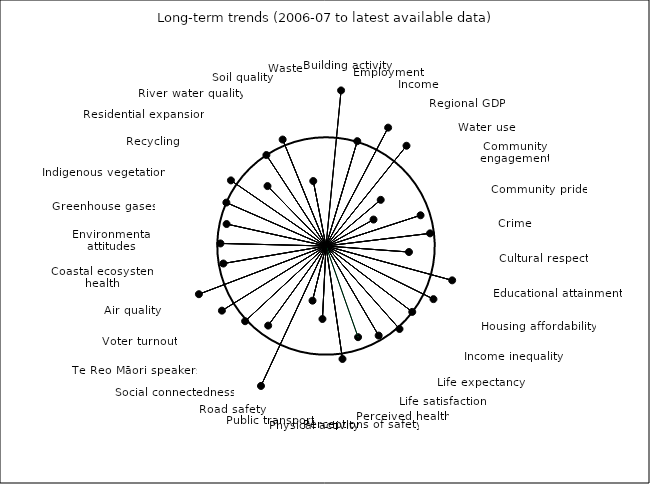
| Category | 2007 | latest |
|---|---|---|
|  | 1 | 0 |
| Building activity | 1 | 1.437 |
|  | 1 | 0 |
| Employment | 1 | 1.006 |
|  | 1 | 0 |
| Income | 1 | 1.229 |
|  | 1 | 0 |
| Regional GDP | 1 | 1.182 |
|  | 1 | 0 |
| Water use | 1 | 0.658 |
|  | 1 | 0 |
| Community engagement | 1 | 0.5 |
|  | 1 | 0 |
| Community pride | 1 | 0.914 |
|  | 1 | 0 |
| Crime | 1 | 0.964 |
|  | 1 | 0 |
| Cultural respect | 1 | 0.765 |
|  | 1 | 0 |
| Educational attainment | 1 | 1.202 |
|  | 1 | 0 |
| Housing affordability | 1 | 1.102 |
|  | 1 | 0 |
| Income inequality | 1 | 0.998 |
|  | 1 | 0 |
| Life expectancy | 1 | 1.019 |
|  | 1 | 0 |
| Life satisfaction | 1 | 0.956 |
|  | 1 | 0 |
| Perceived health | 1 | 0.889 |
|  | 1 | 0 |
| Perceptions of safety | 1 | 1.05 |
|  | 1 | 0 |
| Physical activity | 1 | 0.672 |
|  | 1 | 0 |
| Public transport | 1 | 0.518 |
|  | 1 | 0 |
| Road safety | 1 | 1.419 |
|  | 1 | 0 |
| Social connectedness | 1 | 0.905 |
|  | 1 | 0 |
| Te Reo Māori speakers | 1 | 1.016 |
|  | 1 | 0 |
| Voter turnout | 1 | 1.127 |
|  | 1 | 0 |
| Air quality | 1 | 1.25 |
|  | 1 | 0 |
| Coastal ecosystem health | 1 | 0.957 |
|  | 1 | 0 |
| Environmental attitudes | 1 | 0.971 |
|  | 1 | 0 |
| Greenhouse gases | 1 | 0.936 |
|  | 1 | 0 |
| Indigenous vegetation | 1 | 0.999 |
|  | 1 | 0 |
| Recycling | 1 | 1.062 |
|  | 1 | 0 |
| Residential expansion | 1 | 0.77 |
|  | 1 | 0 |
| River water quality | 1 | 1 |
|  | 1 | 0 |
| Soil quality | 1 | 1.057 |
|  | 1 | 0 |
| Waste | 1 | 0.609 |